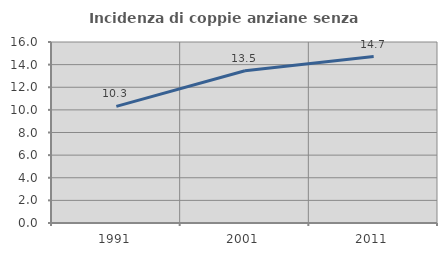
| Category | Incidenza di coppie anziane senza figli  |
|---|---|
| 1991.0 | 10.311 |
| 2001.0 | 13.458 |
| 2011.0 | 14.718 |